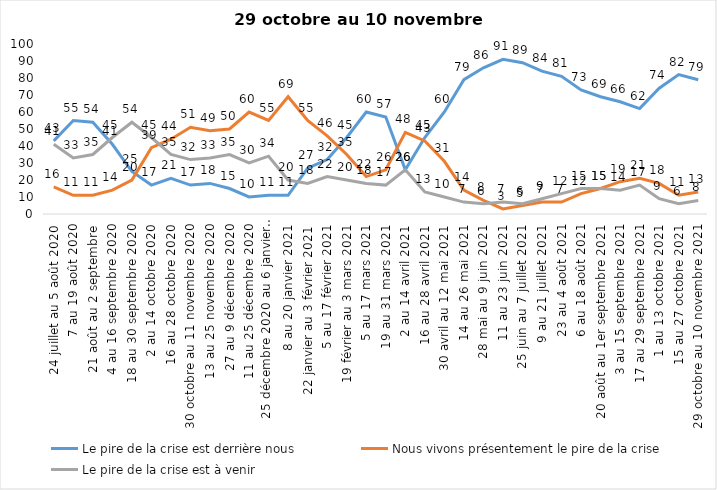
| Category | Le pire de la crise est derrière nous | Nous vivons présentement le pire de la crise | Le pire de la crise est à venir |
|---|---|---|---|
| 24 juillet au 5 août 2020 | 43 | 16 | 41 |
| 7 au 19 août 2020 | 55 | 11 | 33 |
| 21 août au 2 septembre | 54 | 11 | 35 |
| 4 au 16 septembre 2020 | 41 | 14 | 45 |
| 18 au 30 septembre 2020 | 25 | 20 | 54 |
| 2 au 14 octobre 2020 | 17 | 39 | 45 |
| 16 au 28 octobre 2020 | 21 | 44 | 35 |
| 30 octobre au 11 novembre 2020 | 17 | 51 | 32 |
| 13 au 25 novembre 2020 | 18 | 49 | 33 |
| 27 au 9 décembre 2020 | 15 | 50 | 35 |
| 11 au 25 décembre 2020 | 10 | 60 | 30 |
| 25 décembre 2020 au 6 janvier  2021 | 11 | 55 | 34 |
| 8 au 20 janvier 2021 | 11 | 69 | 20 |
| 22 janvier au 3 février 2021 | 27 | 55 | 18 |
| 5 au 17 février 2021 | 32 | 46 | 22 |
| 19 février au 3 mars 2021 | 45 | 35 | 20 |
| 5 au 17 mars 2021 | 60 | 22 | 18 |
| 19 au 31 mars 2021 | 57 | 26 | 17 |
| 2 au 14 avril 2021 | 26 | 48 | 26 |
| 16 au 28 avril 2021 | 45 | 43 | 13 |
| 30 avril au 12 mai 2021 | 60 | 31 | 10 |
| 14 au 26 mai 2021 | 79 | 14 | 7 |
| 28 mai au 9 juin 2021 | 86 | 8 | 6 |
| 11 au 23 juin 2021 | 91 | 3 | 7 |
| 25 juin au 7 juillet 2021 | 89 | 5 | 6 |
| 9 au 21 juillet 2021 | 84 | 7 | 9 |
| 23 au 4 août 2021 | 81 | 7 | 12 |
| 6 au 18 août 2021 | 73 | 12 | 15 |
| 20 août au 1er septembre 2021 | 69 | 15 | 15 |
| 3 au 15 septembre 2021 | 66 | 19 | 14 |
| 17 au 29 septembre 2021 | 62 | 21 | 17 |
| 1 au 13 octobre 2021 | 74 | 18 | 9 |
| 15 au 27 octobre 2021 | 82 | 11 | 6 |
| 29 octobre au 10 novembre 2021 | 79 | 13 | 8 |